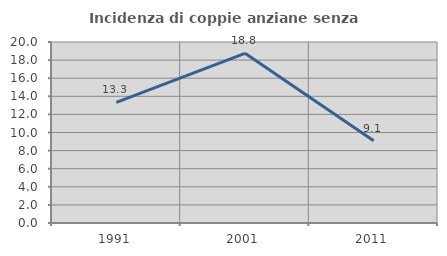
| Category | Incidenza di coppie anziane senza figli  |
|---|---|
| 1991.0 | 13.333 |
| 2001.0 | 18.75 |
| 2011.0 | 9.091 |